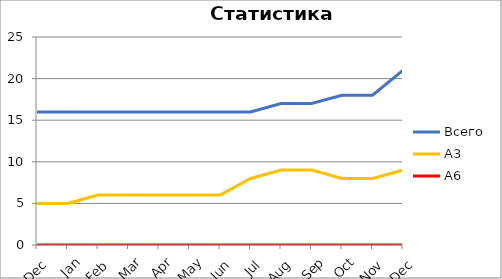
| Category | Всего | А3 | A6 |
|---|---|---|---|
| 0 | 16 | 5 | 0 |
| 1 | 16 | 5 | 0 |
| 2 | 16 | 6 | 0 |
| 3 | 16 | 6 | 0 |
| 4 | 16 | 6 | 0 |
| 5 | 16 | 6 | 0 |
| 6 | 16 | 6 | 0 |
| 7 | 16 | 8 | 0 |
| 8 | 17 | 9 | 0 |
| 9 | 17 | 9 | 0 |
| 10 | 18 | 8 | 0 |
| 11 | 18 | 8 | 0 |
| 12 | 21 | 9 | 0 |